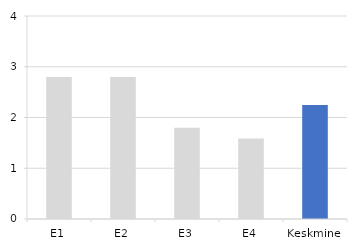
| Category | HETKETASE |
|---|---|
| E1 | 2.8 |
| E2 | 2.8 |
| E3 | 1.8 |
| E4 | 1.588 |
| Keskmine | 2.247 |